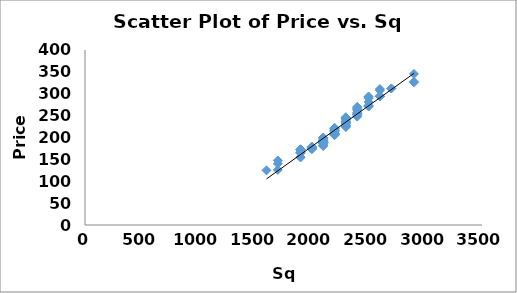
| Category | Price |
|---|---|
| 1600.0 | 125 |
| 1700.0 | 125.9 |
| 1700.0 | 139.9 |
| 1700.0 | 147.4 |
| 1900.0 | 154.3 |
| 1900.0 | 155.4 |
| 1900.0 | 164.1 |
| 1900.0 | 166.2 |
| 1900.0 | 166.5 |
| 1900.0 | 171.6 |
| 1900.0 | 172.4 |
| 1900.0 | 172.7 |
| 1900.0 | 173.1 |
| 2000.0 | 173.6 |
| 2000.0 | 173.6 |
| 2000.0 | 175 |
| 2000.0 | 175.6 |
| 2000.0 | 176 |
| 2000.0 | 176.3 |
| 2000.0 | 177.1 |
| 2000.0 | 179 |
| 2000.0 | 179 |
| 2100.0 | 180.4 |
| 2100.0 | 182.4 |
| 2100.0 | 182.7 |
| 2100.0 | 186.7 |
| 2100.0 | 187 |
| 2100.0 | 188.1 |
| 2100.0 | 188.3 |
| 2100.0 | 188.3 |
| 2100.0 | 188.3 |
| 2100.0 | 188.3 |
| 2100.0 | 189.4 |
| 2100.0 | 190.9 |
| 2100.0 | 192.2 |
| 2100.0 | 192.6 |
| 2100.0 | 192.9 |
| 2100.0 | 194.4 |
| 2100.0 | 198.3 |
| 2100.0 | 198.9 |
| 2100.0 | 199 |
| 2100.0 | 199.8 |
| 2200.0 | 205.1 |
| 2200.0 | 206 |
| 2200.0 | 207.1 |
| 2200.0 | 207.5 |
| 2200.0 | 207.5 |
| 2200.0 | 209 |
| 2200.0 | 209.3 |
| 2200.0 | 209.3 |
| 2200.0 | 209.7 |
| 2200.0 | 209.7 |
| 2200.0 | 213.6 |
| 2200.0 | 216 |
| 2200.0 | 216.8 |
| 2200.0 | 217.8 |
| 2200.0 | 220.9 |
| 2200.0 | 221.1 |
| 2200.0 | 221.5 |
| 2200.0 | 222.1 |
| 2300.0 | 224 |
| 2300.0 | 224.8 |
| 2300.0 | 227.1 |
| 2300.0 | 227.1 |
| 2300.0 | 228.4 |
| 2300.0 | 232.2 |
| 2300.0 | 233 |
| 2300.0 | 234 |
| 2300.0 | 236.4 |
| 2300.0 | 236.8 |
| 2300.0 | 240 |
| 2300.0 | 242.1 |
| 2300.0 | 243.7 |
| 2300.0 | 244.6 |
| 2300.0 | 245.4 |
| 2300.0 | 246 |
| 2300.0 | 246.1 |
| 2400.0 | 247.7 |
| 2400.0 | 251.4 |
| 2400.0 | 252.3 |
| 2400.0 | 253.2 |
| 2400.0 | 254.3 |
| 2400.0 | 257.2 |
| 2400.0 | 263.1 |
| 2400.0 | 263.2 |
| 2400.0 | 266.6 |
| 2400.0 | 269.2 |
| 2400.0 | 269.9 |
| 2500.0 | 270.8 |
| 2500.0 | 271.8 |
| 2500.0 | 273.2 |
| 2500.0 | 281.3 |
| 2500.0 | 289.8 |
| 2500.0 | 292.4 |
| 2500.0 | 293.7 |
| 2600.0 | 294 |
| 2600.0 | 294.3 |
| 2600.0 | 294.5 |
| 2600.0 | 307.8 |
| 2600.0 | 310.8 |
| 2700.0 | 312.1 |
| 2700.0 | 312.1 |
| 2900.0 | 326.3 |
| 2900.0 | 327.2 |
| 2900.0 | 345.3 |